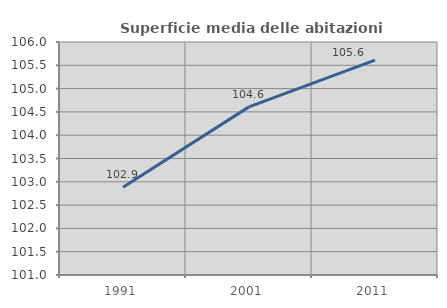
| Category | Superficie media delle abitazioni occupate |
|---|---|
| 1991.0 | 102.883 |
| 2001.0 | 104.608 |
| 2011.0 | 105.611 |